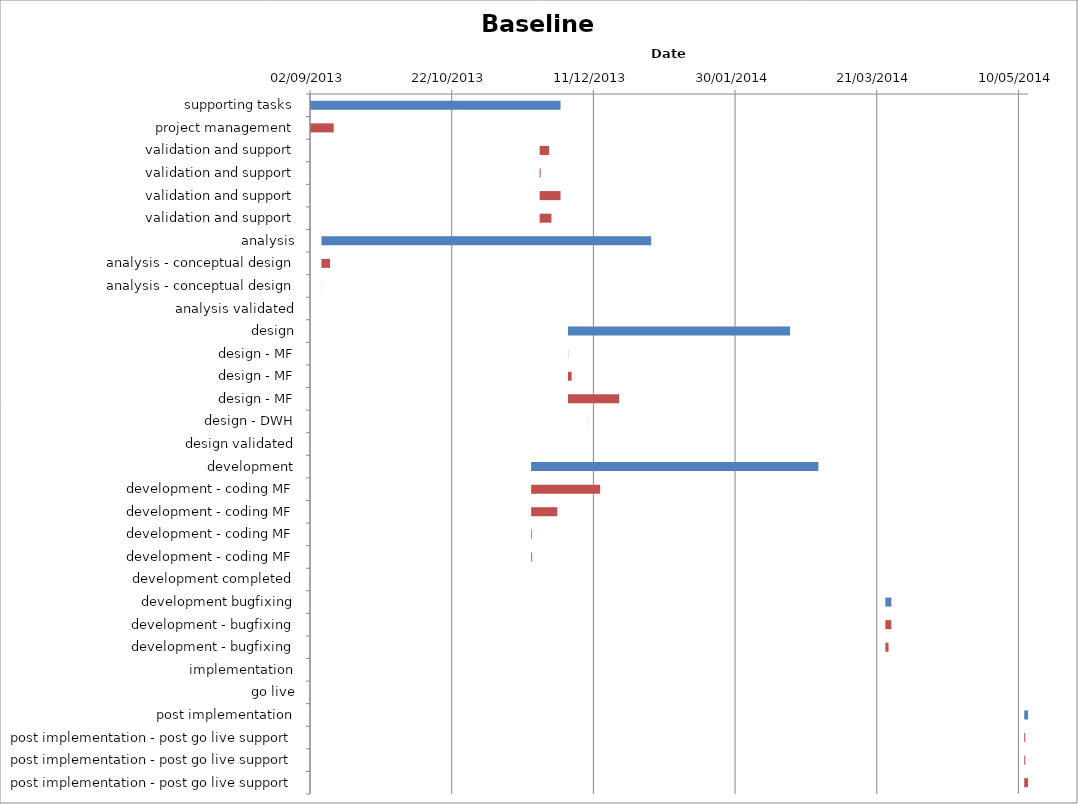
| Category | Baseline start | Actual duration |
|---|---|---|
| supporting tasks | 41519.333 | 88.375 |
| project management | 41519.333 | 8.333 |
| validation and support | 41600.333 | 3.333 |
| validation and support | 41600.333 | 0.375 |
| validation and support | 41600.333 | 7.375 |
| validation and support | 41600.333 | 4.167 |
| analysis | 41523.333 | 116.375 |
| analysis - conceptual design | 41523.333 | 3.042 |
| analysis - conceptual design | 41523.333 | 0.042 |
| analysis validated | 41639.708 | 0 |
| design | 41610.333 | 78.375 |
| design - MF | 41610.333 | 0.083 |
| design - MF | 41610.333 | 1.292 |
| design - MF | 41610.333 | 18.083 |
| design - DWH | 41617.333 | 0.042 |
| design validated | 41688.708 | 0 |
| development | 41597.333 | 101.375 |
| development - coding MF | 41597.333 | 24.375 |
| development - coding MF | 41597.333 | 9.25 |
| development - coding MF | 41597.333 | 0.25 |
| development - coding MF | 41597.333 | 0.333 |
| development completed | 41698.708 | 0 |
| development bugfixing | 41722.333 | 2.125 |
| development - bugfixing | 41722.333 | 2.125 |
| development - bugfixing | 41722.333 | 1.125 |
| implementation | 41768.708 | 0 |
| go live | 41768.708 | 0 |
| post implementation | 41771.333 | 1.333 |
| post implementation - post go live support | 41771.333 | 0.375 |
| post implementation - post go live support | 41771.333 | 0.375 |
| post implementation - post go live support | 41771.333 | 1.333 |